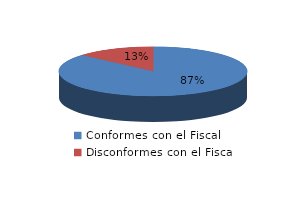
| Category | Series 0 |
|---|---|
| 0 | 77 |
| 1 | 12 |